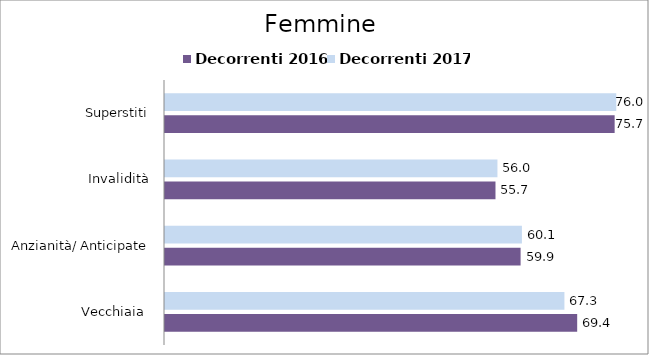
| Category | Decorrenti 2016 | Decorrenti 2017 |
|---|---|---|
| Vecchiaia  | 69.42 | 67.27 |
| Anzianità/ Anticipate | 59.89 | 60.11 |
| Invalidità | 55.66 | 55.99 |
| Superstiti | 75.73 | 76 |